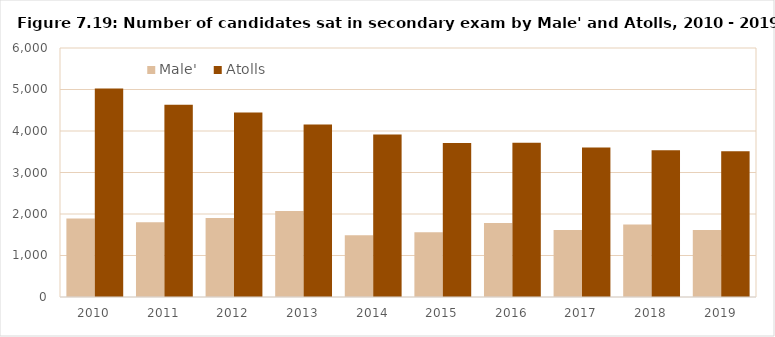
| Category | Male' | Atolls |
|---|---|---|
| 2010.0 | 1894 | 5026 |
| 2011.0 | 1802 | 4630 |
| 2012.0 | 1901 | 4445 |
| 2013.0 | 2072 | 4159 |
| 2014.0 | 1490 | 3914 |
| 2015.0 | 1561 | 3711 |
| 2016.0 | 1782 | 3716 |
| 2017.0 | 1617 | 3603 |
| 2018.0 | 1746 | 3534 |
| 2019.0 | 1614 | 3511 |